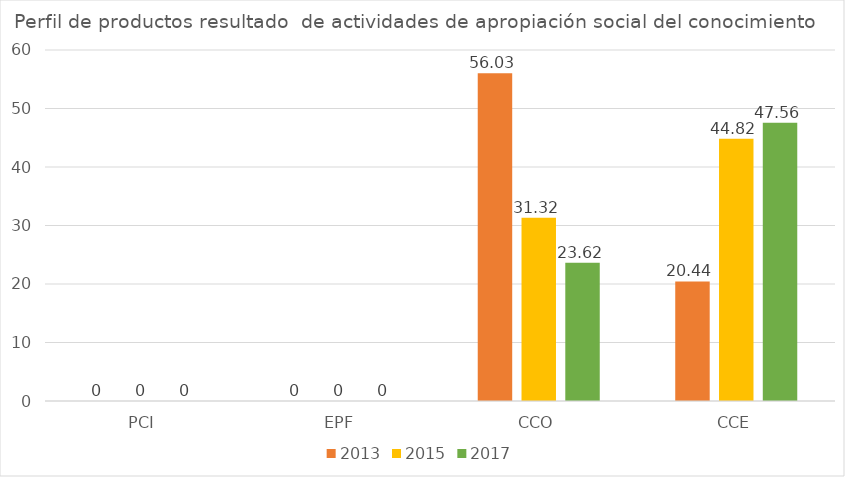
| Category | 2013 | 2015 | 2017 |
|---|---|---|---|
| PCI | 0 | 0 | 0 |
| EPF | 0 | 0 | 0 |
| CCO | 56.03 | 31.32 | 23.62 |
| CCE | 20.44 | 44.82 | 47.56 |